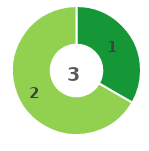
| Category | Series 0 |
|---|---|
| 0 | 1 |
| 1 | 2 |
| 2 | 0 |
| 3 | 0 |
| 4 | 0 |